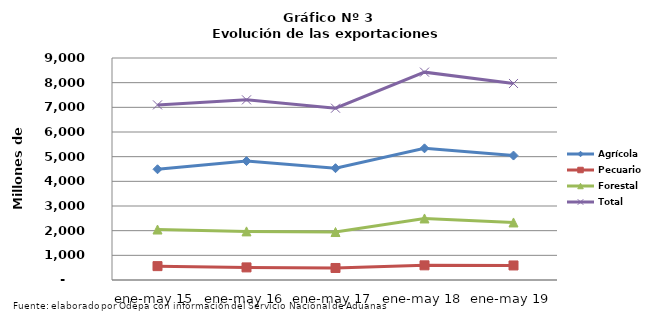
| Category | Agrícola | Pecuario | Forestal | Total |
|---|---|---|---|---|
| ene-may 15 | 4489722 | 562188 | 2046515 | 7098425 |
| ene-may 16 | 4821359 | 510786 | 1971116 | 7303261 |
| ene-may 17 | 4532757 | 487220 | 1944844 | 6964821 |
| ene-may 18 | 5337575 | 594454 | 2494722 | 8426751 |
| ene-may 19 | 5044991 | 589585 | 2332595 | 7967171 |